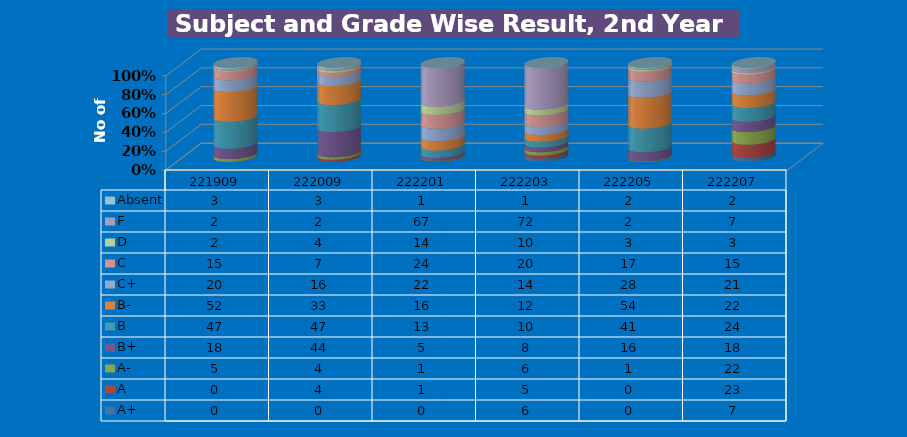
| Category | A+ | A | A- | B+ | B | B- | C+ | C | D | F | Absent |
|---|---|---|---|---|---|---|---|---|---|---|---|
| 221909.0 | 0 | 0 | 5 | 18 | 47 | 52 | 20 | 15 | 2 | 2 | 3 |
| 222009.0 | 0 | 4 | 4 | 44 | 47 | 33 | 16 | 7 | 4 | 2 | 3 |
| 222201.0 | 0 | 1 | 1 | 5 | 13 | 16 | 22 | 24 | 14 | 67 | 1 |
| 222203.0 | 6 | 5 | 6 | 8 | 10 | 12 | 14 | 20 | 10 | 72 | 1 |
| 222205.0 | 0 | 0 | 1 | 16 | 41 | 54 | 28 | 17 | 3 | 2 | 2 |
| 222207.0 | 7 | 23 | 22 | 18 | 24 | 22 | 21 | 15 | 3 | 7 | 2 |